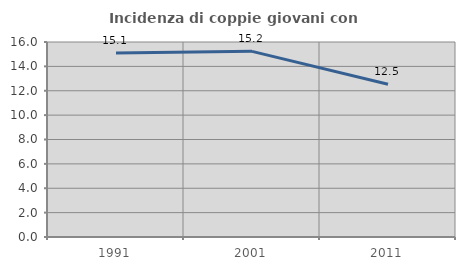
| Category | Incidenza di coppie giovani con figli |
|---|---|
| 1991.0 | 15.098 |
| 2001.0 | 15.234 |
| 2011.0 | 12.533 |